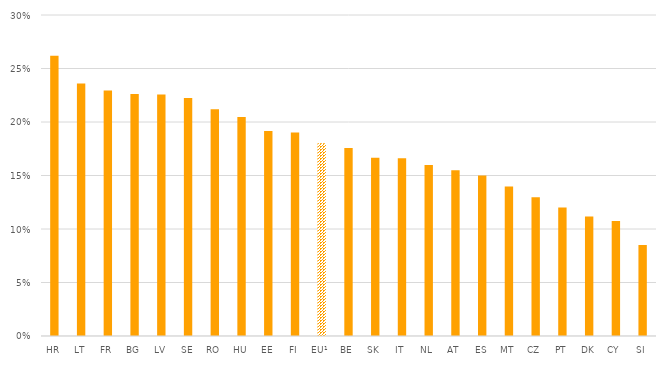
| Category | ICT skills for teaching |
|---|---|
| HR | 0.262 |
| LT | 0.236 |
| FR | 0.229 |
| BG | 0.226 |
| LV | 0.226 |
| SE | 0.222 |
| RO | 0.212 |
| HU | 0.205 |
| EE | 0.192 |
| FI | 0.19 |
| EU¹ | 0.18 |
| BE | 0.176 |
| SK | 0.166 |
| IT | 0.166 |
| NL | 0.16 |
| AT | 0.155 |
| ES | 0.15 |
| MT | 0.14 |
| CZ | 0.13 |
| PT | 0.12 |
| DK | 0.112 |
| CY | 0.108 |
| SI | 0.085 |